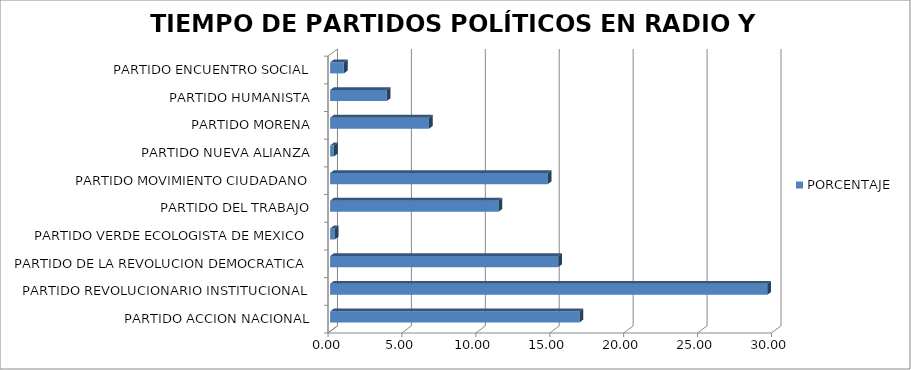
| Category | PORCENTAJE |
|---|---|
| PARTIDO ACCION NACIONAL | 16.864 |
| PARTIDO REVOLUCIONARIO INSTITUCIONAL | 29.57 |
| PARTIDO DE LA REVOLUCION DEMOCRATICA | 15.424 |
| PARTIDO VERDE ECOLOGISTA DE MEXICO | 0.316 |
| PARTIDO DEL TRABAJO | 11.392 |
| PARTIDO MOVIMIENTO CIUDADANO | 14.723 |
| PARTIDO NUEVA ALIANZA | 0.261 |
| PARTIDO MORENA | 6.687 |
| PARTIDO HUMANISTA | 3.83 |
| PARTIDO ENCUENTRO SOCIAL | 0.933 |